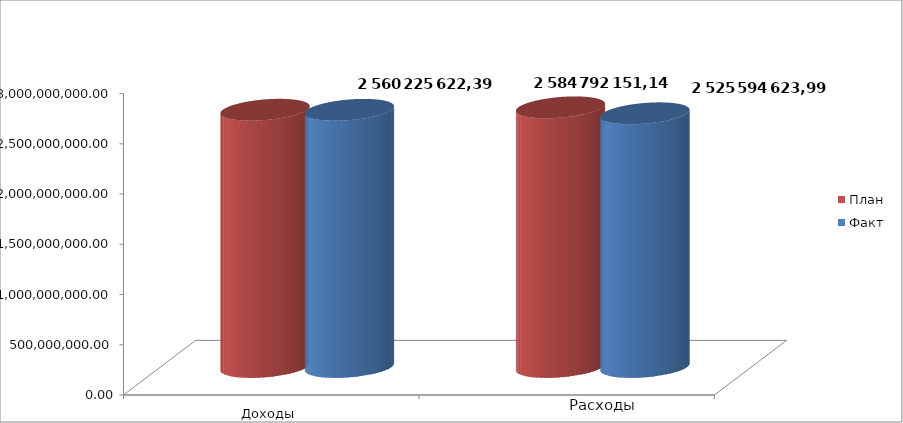
| Category | План | Факт |
|---|---|---|
| 0 | 2560987612.68 | 2560225622.39 |
| 1 | 2584792151.14 | 2525594623.99 |